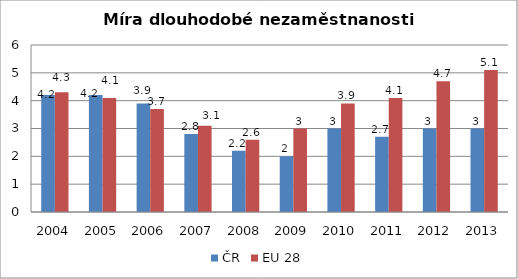
| Category | ČR | EU 28 |
|---|---|---|
| 2004 | 4.2 | 4.3 |
| 2005 | 4.2 | 4.1 |
| 2006 | 3.9 | 3.7 |
| 2007 | 2.8 | 3.1 |
| 2008 | 2.2 | 2.6 |
| 2009 | 2 | 3 |
| 2010 | 3 | 3.9 |
| 2011 | 2.7 | 4.1 |
| 2012 | 3 | 4.7 |
| 2013 | 3 | 5.1 |